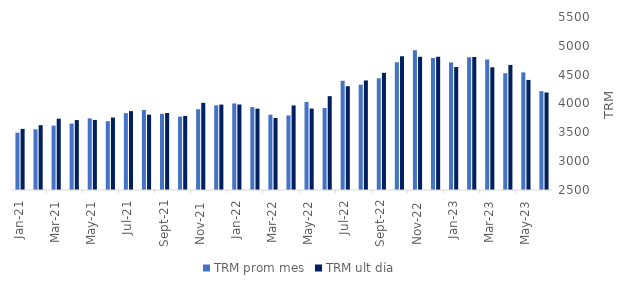
| Category | TRM prom mes | TRM ult día |
|---|---|---|
| 2021-01-01 | 3494.53 | 3559.46 |
| 2021-02-01 | 3552.43 | 3624.39 |
| 2021-03-01 | 3617 | 3736.91 |
| 2021-04-01 | 3651.85 | 3712.89 |
| 2021-05-01 | 3741.96 | 3715.28 |
| 2021-06-01 | 3693 | 3756.67 |
| 2021-07-01 | 3832.24 | 3867.88 |
| 2021-08-01 | 3887.68 | 3806.87 |
| 2021-09-01 | 3821.54 | 3834.68 |
| 2021-10-01 | 3771.68 | 3784.44 |
| 2021-11-01 | 3900.51 | 4010.98 |
| 2021-12-01 | 3967.77 | 3981.16 |
| 2022-01-01 | 4000.72 | 3982.6 |
| 2022-02-01 | 3938.36 | 3910.64 |
| 2022-03-01 | 3805.52 | 3748.15 |
| 2022-04-01 | 3792.98 | 3966.27 |
| 2022-05-01 | 4027.6 | 3912.34 |
| 2022-06-01 | 3922.5 | 4127.47 |
| 2022-07-01 | 4394.01 | 4300.3 |
| 2022-08-01 | 4326.77 | 4400.16 |
| 2022-09-01 | 4437.31 | 4532.07 |
| 2022-10-01 | 4714.96 | 4819.42 |
| 2022-11-01 | 4922.3 | 4809.51 |
| 2022-12-01 | 4787.89 | 4810.2 |
| 2023-01-01 | 4712.18 | 4632.2 |
| 2023-02-01 | 4802.75 | 4808.14 |
| 2023-03-01 | 4760.96 | 4627.27 |
| 2023-04-01 | 4526.03 | 4669 |
| 2023-05-01 | 4539.54 | 4408.65 |
| 2023-06-01 | 4213.53 | 4191.28 |
| 2023-07-01 | 4067.63 | 3923.49 |
| 2023-08-01 | 4066.87 | 4085.33 |
| 2023-09-01 | 4008.41 | 4053.76 |
| 2023-10-01 | 4219.16 | 4060.83 |
| 2023-11-01 | 4040.26 | 3980.67 |